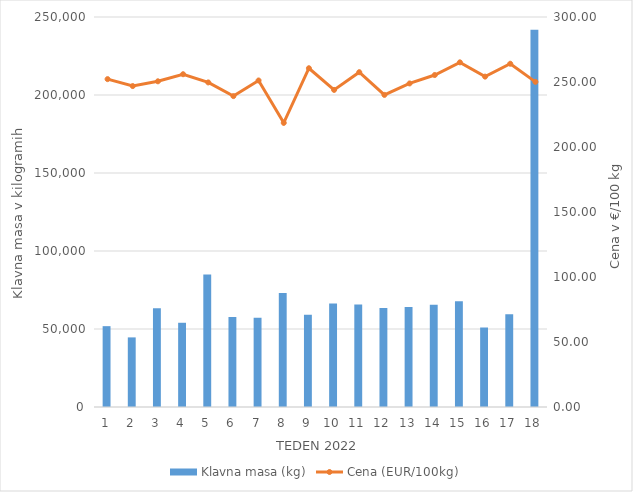
| Category | Klavna masa (kg) |
|---|---|
| 1.0 | 51818 |
| 2.0 | 44619 |
| 3.0 | 63233 |
| 4.0 | 53993 |
| 5.0 | 84871 |
| 6.0 | 57648 |
| 7.0 | 57159 |
| 8.0 | 73139 |
| 9.0 | 59056 |
| 10.0 | 66417 |
| 11.0 | 65723 |
| 12.0 | 63530 |
| 13.0 | 64069 |
| 14.0 | 65564 |
| 15.0 | 67787 |
| 16.0 | 50958 |
| 17.0 | 59387 |
| 18.0 | 241833 |